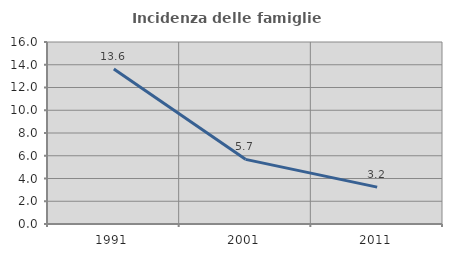
| Category | Incidenza delle famiglie numerose |
|---|---|
| 1991.0 | 13.618 |
| 2001.0 | 5.684 |
| 2011.0 | 3.24 |